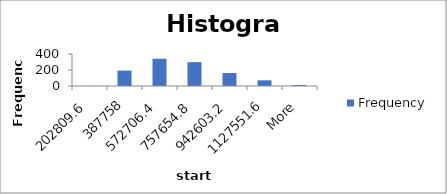
| Category | Frequency |
|---|---|
| 202809.6 | 1 |
| 387758 | 193 |
| 572706.4 | 341 |
| 757654.8 | 298 |
| 942603.2 | 162 |
| 1127551.6 | 71 |
| More | 13 |